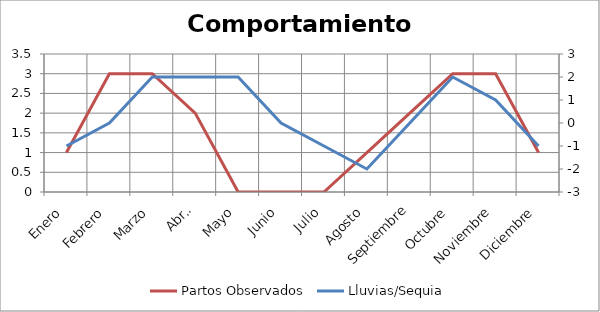
| Category | Partos Observados |
|---|---|
| Enero | 1 |
| Febrero | 3 |
| Marzo | 3 |
| Abril | 2 |
| Mayo | 0 |
| Junio | 0 |
| Julio | 0 |
| Agosto | 1 |
| Septiembre | 2 |
| Octubre | 3 |
| Noviembre | 3 |
| Diciembre | 1 |